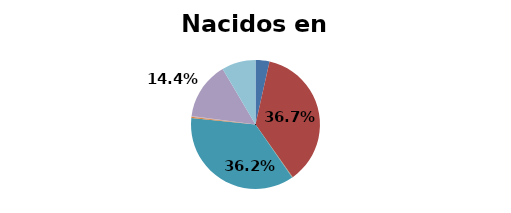
| Category | Nacidos en Perú |
|---|---|
| Mapuche | 0.035 |
| Aymara | 0.367 |
| Rapa Nui | 0.001 |
| Lican Antai | 0.001 |
| Quechua | 0.362 |
| Colla | 0.003 |
| Diaguita | 0.001 |
| Kawésqar | 0.001 |
| Yagán o Yámana | 0 |
| Otro | 0.144 |
| Pueblo ignorado | 0.085 |